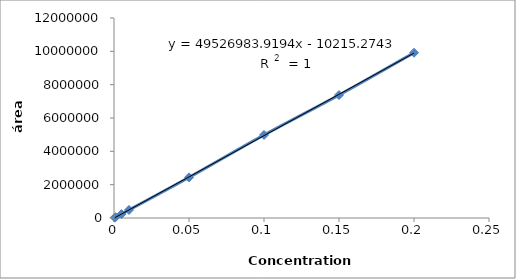
| Category | Área |
|---|---|
| 0.2 | 9914957 |
| 0.15 | 7377126 |
| 0.1 | 4980332 |
| 0.05 | 2437136 |
| 0.01 | 481849 |
| 0.005 | 234052 |
| 0.001 | 49160 |
| 0.0005 | 24353 |